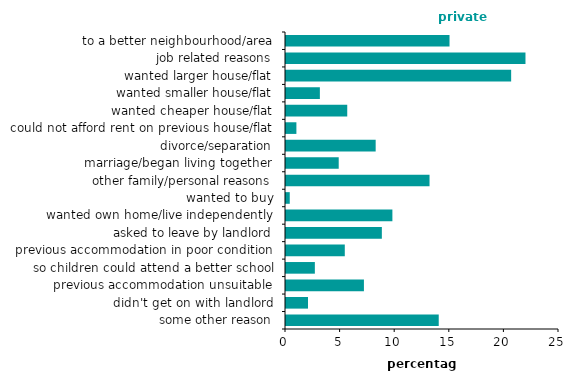
| Category | private renters |
|---|---|
| to a better neighbourhood/area | 14.974 |
| job related reasons | 21.93 |
| wanted larger house/flat | 20.618 |
| wanted smaller house/flat | 3.101 |
| wanted cheaper house/flat | 5.609 |
| could not afford rent on previous house/flat | 0.952 |
| divorce/separation | 8.212 |
| marriage/began living together | 4.827 |
| other family/personal reasons | 13.144 |
| wanted to buy | 0.344 |
| wanted own home/live independently | 9.743 |
| asked to leave by landlord | 8.777 |
| previous accommodation in poor condition | 5.384 |
| so children could attend a better school | 2.643 |
| previous accommodation unsuitable | 7.136 |
| didn't get on with landlord | 2.014 |
| some other reason | 13.986 |